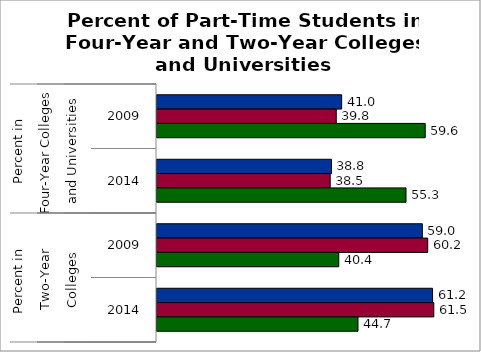
| Category | 50 states and D.C. | SREB states | State |
|---|---|---|---|
| 0 | 41.037 | 39.84 | 59.609 |
| 1 | 38.765 | 38.487 | 55.334 |
| 2 | 58.963 | 60.16 | 40.391 |
| 3 | 61.235 | 61.513 | 44.666 |